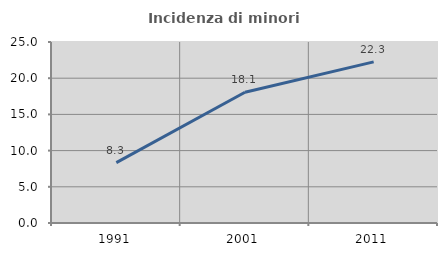
| Category | Incidenza di minori stranieri |
|---|---|
| 1991.0 | 8.333 |
| 2001.0 | 18.056 |
| 2011.0 | 22.255 |